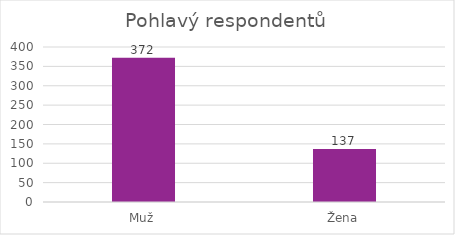
| Category | Series 0 |
|---|---|
| Muž | 372 |
| Žena | 137 |